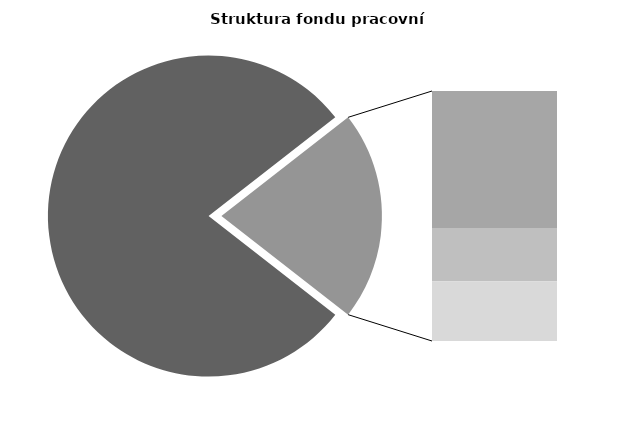
| Category | Series 0 |
|---|---|
| Průměrná měsíční odpracovaná doba bez přesčasu | 136.019 |
| Dovolená | 19.877 |
| Nemoc | 7.733 |
| Jiné | 8.683 |